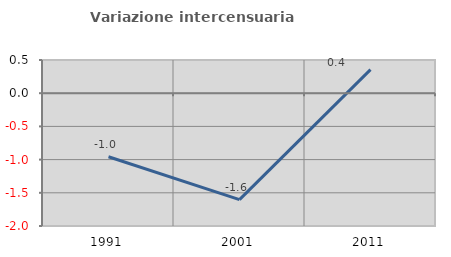
| Category | Variazione intercensuaria annua |
|---|---|
| 1991.0 | -0.956 |
| 2001.0 | -1.602 |
| 2011.0 | 0.355 |